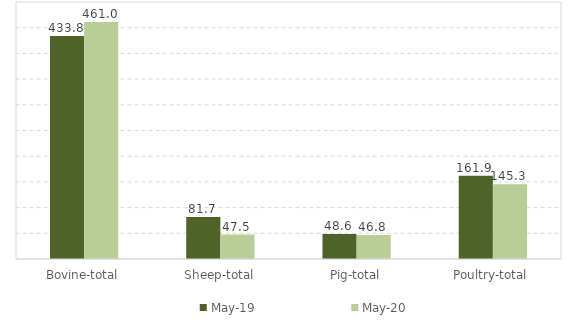
| Category | May-19 | May-20 |
|---|---|---|
| Bovine-total | 433.8 | 461 |
| Sheep-total | 81.7 | 47.5 |
| Pig-total | 48.6 | 46.8 |
| Poultry-total | 161.9 | 145.3 |